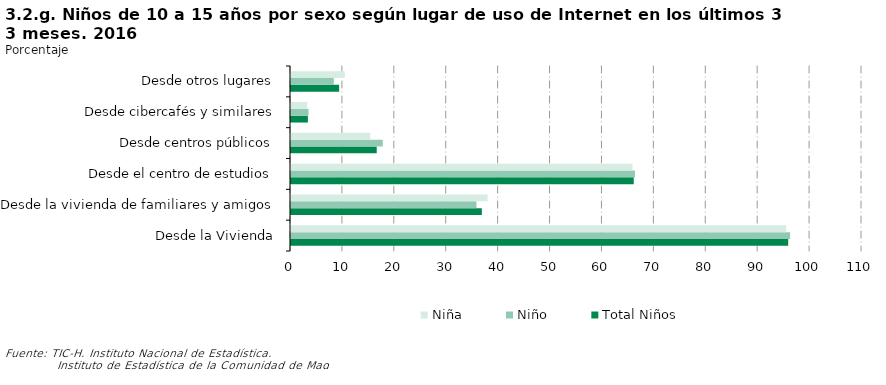
| Category | Total Niños | Niño | Niña |
|---|---|---|---|
| Desde la Vivienda | 95.786 | 96.148 | 95.401 |
| Desde la vivienda de familiares y amigos | 36.763 | 35.727 | 37.865 |
| Desde el centro de estudios | 66.027 | 66.262 | 65.776 |
| Desde centros públicos | 16.515 | 17.675 | 15.281 |
| Desde cibercafés y similares | 3.253 | 3.377 | 3.122 |
| Desde otros lugares | 9.273 | 8.246 | 10.365 |